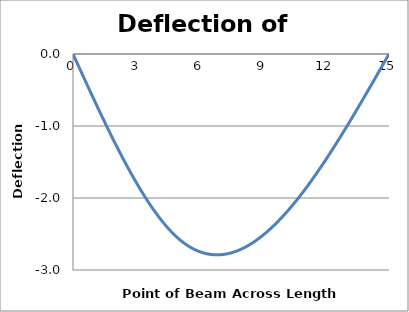
| Category | deflection
(mm) |
|---|---|
| 0.0 | 0 |
| 0.1 | -0.064 |
| 0.2 | -0.128 |
| 0.3 | -0.192 |
| 0.4 | -0.256 |
| 0.5 | -0.32 |
| 0.6 | -0.383 |
| 0.7 | -0.447 |
| 0.8 | -0.51 |
| 0.9 | -0.573 |
| 1.0 | -0.635 |
| 1.1 | -0.698 |
| 1.2 | -0.76 |
| 1.3 | -0.821 |
| 1.4 | -0.883 |
| 1.5 | -0.943 |
| 1.6 | -1.004 |
| 1.7 | -1.064 |
| 1.8 | -1.123 |
| 1.9 | -1.182 |
| 2.0 | -1.24 |
| 2.1 | -1.298 |
| 2.2 | -1.355 |
| 2.3 | -1.411 |
| 2.4 | -1.466 |
| 2.5 | -1.521 |
| 2.6 | -1.575 |
| 2.7 | -1.629 |
| 2.8 | -1.681 |
| 2.9 | -1.733 |
| 3.0 | -1.783 |
| 3.1 | -1.833 |
| 3.2 | -1.882 |
| 3.3 | -1.93 |
| 3.4 | -1.976 |
| 3.5 | -2.022 |
| 3.6 | -2.067 |
| 3.7 | -2.11 |
| 3.8 | -2.153 |
| 3.9 | -2.194 |
| 4.0 | -2.234 |
| 4.1 | -2.273 |
| 4.2 | -2.311 |
| 4.3 | -2.347 |
| 4.4 | -2.382 |
| 4.5 | -2.415 |
| 4.6 | -2.448 |
| 4.7 | -2.478 |
| 4.8 | -2.508 |
| 4.9 | -2.536 |
| 5.0 | -2.562 |
| 5.1 | -2.587 |
| 5.2 | -2.61 |
| 5.3 | -2.632 |
| 5.4 | -2.652 |
| 5.5 | -2.671 |
| 5.6 | -2.689 |
| 5.7 | -2.705 |
| 5.8 | -2.719 |
| 5.9 | -2.732 |
| 6.0 | -2.744 |
| 6.1 | -2.754 |
| 6.2 | -2.763 |
| 6.3 | -2.771 |
| 6.4 | -2.777 |
| 6.5 | -2.782 |
| 6.6 | -2.786 |
| 6.7 | -2.788 |
| 6.8 | -2.789 |
| 6.9 | -2.789 |
| 7.0 | -2.788 |
| 7.1 | -2.785 |
| 7.2 | -2.781 |
| 7.3 | -2.776 |
| 7.4 | -2.77 |
| 7.5 | -2.762 |
| 7.6 | -2.754 |
| 7.7 | -2.744 |
| 7.8 | -2.733 |
| 7.9 | -2.721 |
| 8.0 | -2.708 |
| 8.1 | -2.694 |
| 8.2 | -2.679 |
| 8.3 | -2.663 |
| 8.4 | -2.645 |
| 8.5 | -2.627 |
| 8.6 | -2.608 |
| 8.7 | -2.588 |
| 8.8 | -2.566 |
| 8.9 | -2.544 |
| 9.0 | -2.521 |
| 9.1 | -2.497 |
| 9.2 | -2.472 |
| 9.3 | -2.446 |
| 9.4 | -2.42 |
| 9.5 | -2.392 |
| 9.6 | -2.364 |
| 9.7 | -2.334 |
| 9.8 | -2.304 |
| 9.9 | -2.273 |
| 10.0 | -2.242 |
| 10.1 | -2.209 |
| 10.2 | -2.176 |
| 10.3 | -2.142 |
| 10.4 | -2.108 |
| 10.5 | -2.072 |
| 10.6 | -2.036 |
| 10.7 | -2 |
| 10.8 | -1.962 |
| 10.9 | -1.924 |
| 11.0 | -1.886 |
| 11.1 | -1.846 |
| 11.2 | -1.807 |
| 11.3 | -1.766 |
| 11.4 | -1.725 |
| 11.5 | -1.684 |
| 11.6 | -1.642 |
| 11.7 | -1.599 |
| 11.8 | -1.556 |
| 11.9 | -1.512 |
| 12.0 | -1.468 |
| 12.1 | -1.424 |
| 12.2 | -1.379 |
| 12.3 | -1.333 |
| 12.4 | -1.287 |
| 12.5 | -1.241 |
| 12.6 | -1.194 |
| 12.7 | -1.147 |
| 12.8 | -1.1 |
| 12.9 | -1.052 |
| 13.0 | -1.004 |
| 13.1 | -0.956 |
| 13.2 | -0.907 |
| 13.3 | -0.859 |
| 13.4 | -0.809 |
| 13.5 | -0.76 |
| 13.6 | -0.71 |
| 13.7 | -0.661 |
| 13.8 | -0.61 |
| 13.9 | -0.56 |
| 14.0 | -0.51 |
| 14.1 | -0.459 |
| 14.2 | -0.409 |
| 14.3 | -0.358 |
| 14.4 | -0.307 |
| 14.5 | -0.256 |
| 14.6 | -0.205 |
| 14.7 | -0.154 |
| 14.8 | -0.102 |
| 14.9 | -0.051 |
| 15.0 | 0 |